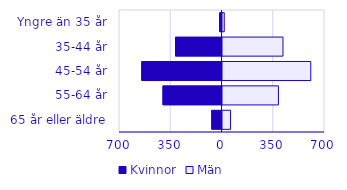
| Category | Kvinnor | Män |
|---|---|---|
| 0 | -16 | 12 |
| 1 | -317 | 413 |
| 2 | -548 | 603 |
| 3 | -403 | 382 |
| 4 | -70 | 55 |